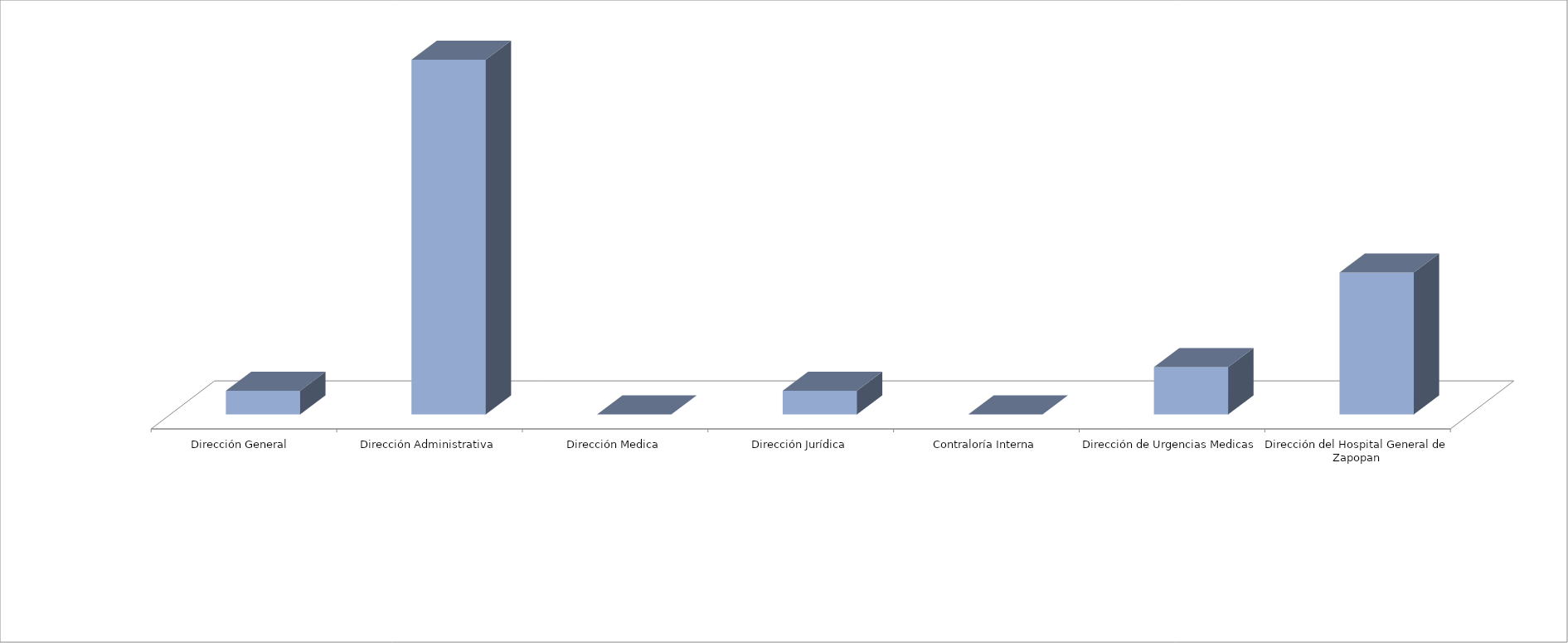
| Category | Series 0 | Series 1 |
|---|---|---|
| Dirección General  |  | 1 |
| Dirección Administrativa |  | 15 |
| Dirección Medica |  | 0 |
| Dirección Jurídica |  | 1 |
| Contraloría Interna |  | 0 |
| Dirección de Urgencias Medicas |  | 2 |
| Dirección del Hospital General de Zapopan |  | 6 |